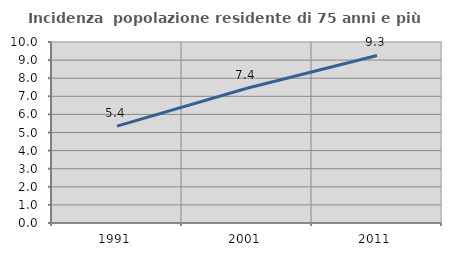
| Category | Incidenza  popolazione residente di 75 anni e più |
|---|---|
| 1991.0 | 5.352 |
| 2001.0 | 7.446 |
| 2011.0 | 9.258 |